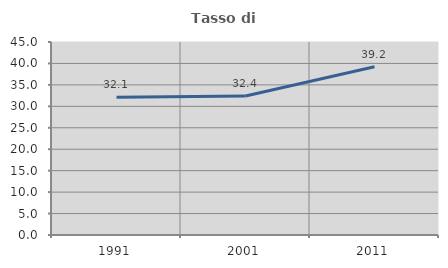
| Category | Tasso di occupazione   |
|---|---|
| 1991.0 | 32.107 |
| 2001.0 | 32.429 |
| 2011.0 | 39.25 |